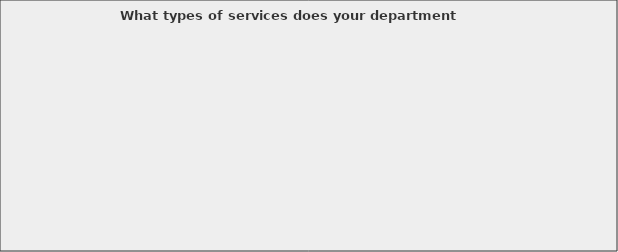
| Category | Series 0 |
|---|---|
| Tax audits of special districts | 0.167 |
| Sell premade maps | 0.567 |
| Provide custom mapping support | 0.667 |
| Print & sell mapbooks | 0.433 |
| Sell another company's mapbooks | 0.1 |
| Assign Addresses | 0.867 |
| Provide Emergency Mapping Support | 0.7 |
| Calculate mileage for fuel tax reimbursement | 0.567 |